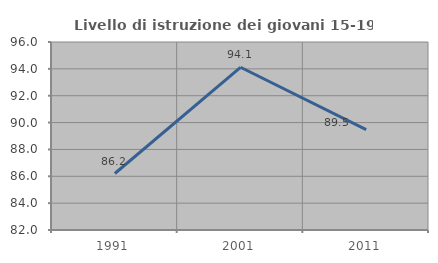
| Category | Livello di istruzione dei giovani 15-19 anni |
|---|---|
| 1991.0 | 86.207 |
| 2001.0 | 94.118 |
| 2011.0 | 89.474 |